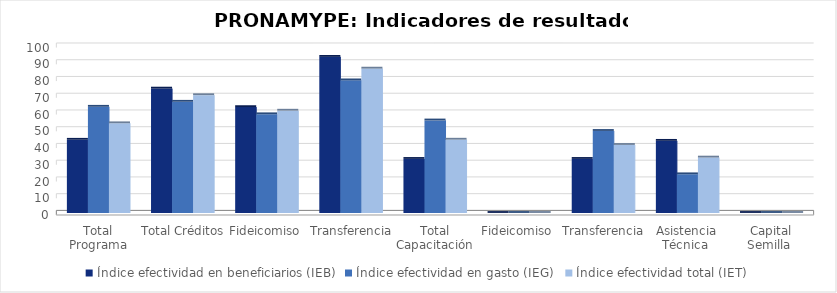
| Category | Índice efectividad en beneficiarios (IEB) | Índice efectividad en gasto (IEG)  | Índice efectividad total (IET) |
|---|---|---|---|
| Total Programa | 43.713 | 63.418 | 53.566 |
| Total Créditos | 74.28 | 66.408 | 70.344 |
| Fideicomiso | 63.222 | 58.942 | 61.082 |
| Transferencia | 93.229 | 79.199 | 86.214 |
| Total Capacitación | 32.275 | 55.242 | 43.758 |
| Fideicomiso | 0 | 0 | 0 |
| Transferencia | 32.275 | 48.982 | 40.628 |
| Asistencia Técnica  | 43.077 | 23.092 | 33.084 |
| Capital Semilla  | 0 | 0 | 0 |